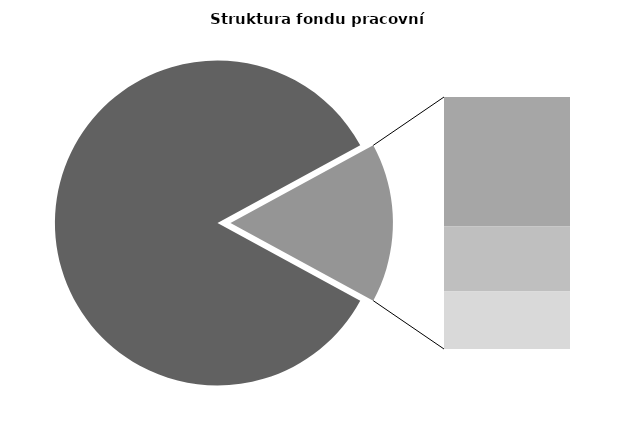
| Category | Series 0 |
|---|---|
| Průměrná měsíční odpracovaná doba bez přesčasu | 141.992 |
| Dovolená | 13.762 |
| Nemoc | 6.893 |
| Jiné | 6.113 |